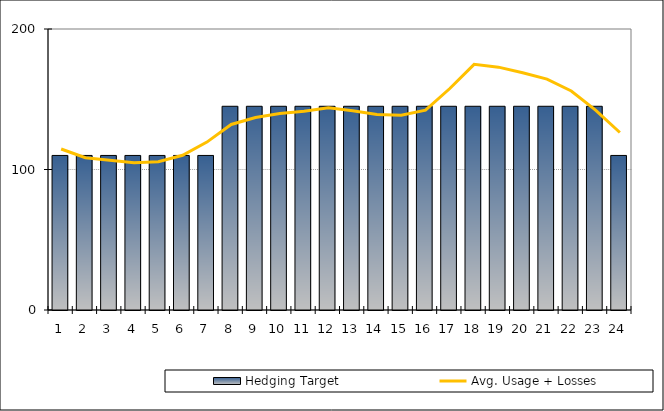
| Category | Hedging Target |
|---|---|
| 1.0 | 110 |
| 2.0 | 110 |
| 3.0 | 110 |
| 4.0 | 110 |
| 5.0 | 110 |
| 6.0 | 110 |
| 7.0 | 110 |
| 8.0 | 145 |
| 9.0 | 145 |
| 10.0 | 145 |
| 11.0 | 145 |
| 12.0 | 145 |
| 13.0 | 145 |
| 14.0 | 145 |
| 15.0 | 145 |
| 16.0 | 145 |
| 17.0 | 145 |
| 18.0 | 145 |
| 19.0 | 145 |
| 20.0 | 145 |
| 21.0 | 145 |
| 22.0 | 145 |
| 23.0 | 145 |
| 24.0 | 110 |